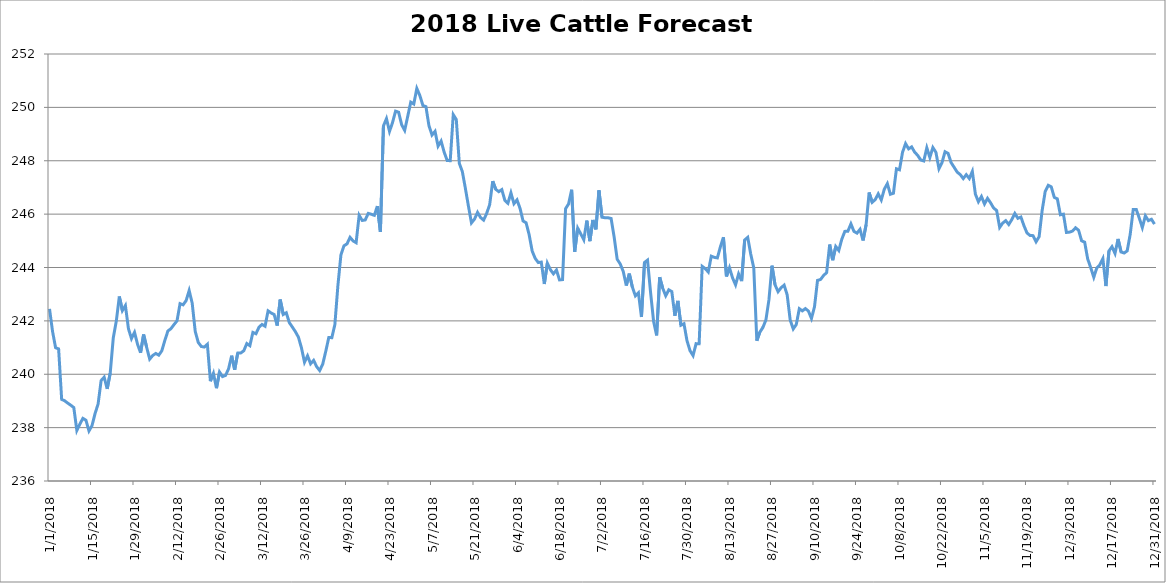
| Category | 2018 Live Cattle Forecast Model |
|---|---|
| 01/01/2018 | 242.449 |
| 02/01/2018 | 241.603 |
| 03/01/2018 | 240.994 |
| 04/01/2018 | 240.949 |
| 05/01/2018 | 239.059 |
| 06/01/2018 | 239.005 |
| 07/01/2018 | 238.918 |
| 08/01/2018 | 238.84 |
| 09/01/2018 | 238.751 |
| 10/01/2018 | 237.894 |
| 11/01/2018 | 238.135 |
| 12/01/2018 | 238.347 |
| 13/01/2018 | 238.277 |
| 14/01/2018 | 237.875 |
| 15/01/2018 | 238.075 |
| 16/01/2018 | 238.527 |
| 17/01/2018 | 238.882 |
| 18/01/2018 | 239.764 |
| 19/01/2018 | 239.89 |
| 20/01/2018 | 239.452 |
| 21/01/2018 | 240.049 |
| 22/01/2018 | 241.358 |
| 23/01/2018 | 241.991 |
| 24/01/2018 | 242.912 |
| 25/01/2018 | 242.385 |
| 26/01/2018 | 242.575 |
| 27/01/2018 | 241.707 |
| 28/01/2018 | 241.337 |
| 29/01/2018 | 241.57 |
| 30/01/2018 | 241.122 |
| 31/01/2018 | 240.807 |
| 01/02/2018 | 241.488 |
| 02/02/2018 | 241.01 |
| 03/02/2018 | 240.567 |
| 04/02/2018 | 240.703 |
| 05/02/2018 | 240.78 |
| 06/02/2018 | 240.716 |
| 07/02/2018 | 240.883 |
| 08/02/2018 | 241.271 |
| 09/02/2018 | 241.621 |
| 10/02/2018 | 241.71 |
| 11/02/2018 | 241.86 |
| 12/02/2018 | 242.002 |
| 13/02/2018 | 242.646 |
| 14/02/2018 | 242.601 |
| 15/02/2018 | 242.759 |
| 16/02/2018 | 243.138 |
| 17/02/2018 | 242.662 |
| 18/02/2018 | 241.605 |
| 19/02/2018 | 241.191 |
| 20/02/2018 | 241.04 |
| 21/02/2018 | 241.019 |
| 22/02/2018 | 241.123 |
| 23/02/2018 | 239.741 |
| 24/02/2018 | 240.033 |
| 25/02/2018 | 239.478 |
| 26/02/2018 | 240.085 |
| 27/02/2018 | 239.913 |
| 28/02/2018 | 239.957 |
| 01/03/2018 | 240.209 |
| 02/03/2018 | 240.696 |
| 03/03/2018 | 240.17 |
| 04/03/2018 | 240.793 |
| 05/03/2018 | 240.798 |
| 06/03/2018 | 240.882 |
| 07/03/2018 | 241.151 |
| 08/03/2018 | 241.071 |
| 09/03/2018 | 241.568 |
| 10/03/2018 | 241.518 |
| 11/03/2018 | 241.762 |
| 12/03/2018 | 241.867 |
| 13/03/2018 | 241.799 |
| 14/03/2018 | 242.375 |
| 15/03/2018 | 242.297 |
| 16/03/2018 | 242.238 |
| 17/03/2018 | 241.824 |
| 18/03/2018 | 242.798 |
| 19/03/2018 | 242.24 |
| 20/03/2018 | 242.304 |
| 21/03/2018 | 241.934 |
| 22/03/2018 | 241.768 |
| 23/03/2018 | 241.596 |
| 24/03/2018 | 241.388 |
| 25/03/2018 | 240.987 |
| 26/03/2018 | 240.451 |
| 27/03/2018 | 240.691 |
| 28/03/2018 | 240.393 |
| 29/03/2018 | 240.52 |
| 30/03/2018 | 240.286 |
| 31/03/2018 | 240.139 |
| 01/04/2018 | 240.38 |
| 02/04/2018 | 240.858 |
| 03/04/2018 | 241.378 |
| 04/04/2018 | 241.37 |
| 05/04/2018 | 241.86 |
| 06/04/2018 | 243.325 |
| 07/04/2018 | 244.479 |
| 08/04/2018 | 244.812 |
| 09/04/2018 | 244.887 |
| 10/04/2018 | 245.13 |
| 11/04/2018 | 244.997 |
| 12/04/2018 | 244.929 |
| 13/04/2018 | 245.957 |
| 14/04/2018 | 245.763 |
| 15/04/2018 | 245.781 |
| 16/04/2018 | 246.028 |
| 17/04/2018 | 245.996 |
| 18/04/2018 | 245.955 |
| 19/04/2018 | 246.301 |
| 20/04/2018 | 245.336 |
| 21/04/2018 | 249.305 |
| 22/04/2018 | 249.578 |
| 23/04/2018 | 249.098 |
| 24/04/2018 | 249.434 |
| 25/04/2018 | 249.859 |
| 26/04/2018 | 249.819 |
| 27/04/2018 | 249.351 |
| 28/04/2018 | 249.139 |
| 29/04/2018 | 249.664 |
| 30/04/2018 | 250.197 |
| 01/05/2018 | 250.126 |
| 02/05/2018 | 250.71 |
| 03/05/2018 | 250.443 |
| 04/05/2018 | 250.071 |
| 05/05/2018 | 250.027 |
| 06/05/2018 | 249.309 |
| 07/05/2018 | 248.964 |
| 08/05/2018 | 249.102 |
| 09/05/2018 | 248.549 |
| 10/05/2018 | 248.736 |
| 11/05/2018 | 248.323 |
| 12/05/2018 | 248.01 |
| 13/05/2018 | 248.001 |
| 14/05/2018 | 249.728 |
| 15/05/2018 | 249.547 |
| 16/05/2018 | 247.9 |
| 17/05/2018 | 247.591 |
| 18/05/2018 | 246.962 |
| 19/05/2018 | 246.3 |
| 20/05/2018 | 245.671 |
| 21/05/2018 | 245.813 |
| 22/05/2018 | 246.066 |
| 23/05/2018 | 245.872 |
| 24/05/2018 | 245.776 |
| 25/05/2018 | 246.023 |
| 26/05/2018 | 246.36 |
| 27/05/2018 | 247.236 |
| 28/05/2018 | 246.931 |
| 29/05/2018 | 246.842 |
| 30/05/2018 | 246.918 |
| 31/05/2018 | 246.515 |
| 01/06/2018 | 246.406 |
| 02/06/2018 | 246.797 |
| 03/06/2018 | 246.39 |
| 04/06/2018 | 246.532 |
| 05/06/2018 | 246.217 |
| 06/06/2018 | 245.743 |
| 07/06/2018 | 245.676 |
| 08/06/2018 | 245.228 |
| 09/06/2018 | 244.615 |
| 10/06/2018 | 244.34 |
| 11/06/2018 | 244.186 |
| 12/06/2018 | 244.203 |
| 13/06/2018 | 243.382 |
| 14/06/2018 | 244.163 |
| 15/06/2018 | 243.92 |
| 16/06/2018 | 243.761 |
| 17/06/2018 | 243.905 |
| 18/06/2018 | 243.535 |
| 19/06/2018 | 243.543 |
| 20/06/2018 | 246.204 |
| 21/06/2018 | 246.383 |
| 22/06/2018 | 246.915 |
| 23/06/2018 | 244.59 |
| 24/06/2018 | 245.475 |
| 25/06/2018 | 245.261 |
| 26/06/2018 | 245.041 |
| 27/06/2018 | 245.757 |
| 28/06/2018 | 244.987 |
| 29/06/2018 | 245.782 |
| 30/06/2018 | 245.431 |
| 01/07/2018 | 246.89 |
| 02/07/2018 | 245.887 |
| 03/07/2018 | 245.863 |
| 04/07/2018 | 245.863 |
| 05/07/2018 | 245.834 |
| 06/07/2018 | 245.143 |
| 07/07/2018 | 244.308 |
| 08/07/2018 | 244.132 |
| 09/07/2018 | 243.849 |
| 10/07/2018 | 243.324 |
| 11/07/2018 | 243.771 |
| 12/07/2018 | 243.267 |
| 13/07/2018 | 242.937 |
| 14/07/2018 | 243.051 |
| 15/07/2018 | 242.144 |
| 16/07/2018 | 244.189 |
| 17/07/2018 | 244.279 |
| 18/07/2018 | 243.068 |
| 19/07/2018 | 241.978 |
| 20/07/2018 | 241.459 |
| 21/07/2018 | 243.634 |
| 22/07/2018 | 243.223 |
| 23/07/2018 | 242.941 |
| 24/07/2018 | 243.163 |
| 25/07/2018 | 243.097 |
| 26/07/2018 | 242.192 |
| 27/07/2018 | 242.749 |
| 28/07/2018 | 241.838 |
| 29/07/2018 | 241.894 |
| 30/07/2018 | 241.256 |
| 31/07/2018 | 240.884 |
| 01/08/2018 | 240.7 |
| 02/08/2018 | 241.147 |
| 03/08/2018 | 241.142 |
| 04/08/2018 | 244.044 |
| 05/08/2018 | 243.959 |
| 06/08/2018 | 243.831 |
| 07/08/2018 | 244.425 |
| 08/08/2018 | 244.38 |
| 09/08/2018 | 244.359 |
| 10/08/2018 | 244.774 |
| 11/08/2018 | 245.134 |
| 12/08/2018 | 243.664 |
| 13/08/2018 | 243.99 |
| 14/08/2018 | 243.612 |
| 15/08/2018 | 243.35 |
| 16/08/2018 | 243.76 |
| 17/08/2018 | 243.493 |
| 18/08/2018 | 245.035 |
| 19/08/2018 | 245.131 |
| 20/08/2018 | 244.501 |
| 21/08/2018 | 243.986 |
| 22/08/2018 | 241.256 |
| 23/08/2018 | 241.579 |
| 24/08/2018 | 241.754 |
| 25/08/2018 | 242.037 |
| 26/08/2018 | 242.796 |
| 27/08/2018 | 244.067 |
| 28/08/2018 | 243.352 |
| 29/08/2018 | 243.093 |
| 30/08/2018 | 243.244 |
| 31/08/2018 | 243.338 |
| 01/09/2018 | 242.976 |
| 02/09/2018 | 242.027 |
| 03/09/2018 | 241.697 |
| 04/09/2018 | 241.864 |
| 05/09/2018 | 242.457 |
| 06/09/2018 | 242.375 |
| 07/09/2018 | 242.461 |
| 08/09/2018 | 242.368 |
| 09/09/2018 | 242.09 |
| 10/09/2018 | 242.528 |
| 11/09/2018 | 243.517 |
| 12/09/2018 | 243.551 |
| 13/09/2018 | 243.703 |
| 14/09/2018 | 243.807 |
| 15/09/2018 | 244.86 |
| 16/09/2018 | 244.273 |
| 17/09/2018 | 244.786 |
| 18/09/2018 | 244.638 |
| 19/09/2018 | 245.062 |
| 20/09/2018 | 245.353 |
| 21/09/2018 | 245.36 |
| 22/09/2018 | 245.634 |
| 23/09/2018 | 245.353 |
| 24/09/2018 | 245.288 |
| 25/09/2018 | 245.431 |
| 26/09/2018 | 245.013 |
| 27/09/2018 | 245.601 |
| 28/09/2018 | 246.81 |
| 29/09/2018 | 246.442 |
| 30/09/2018 | 246.544 |
| 01/10/2018 | 246.758 |
| 02/10/2018 | 246.532 |
| 03/10/2018 | 246.935 |
| 04/10/2018 | 247.142 |
| 05/10/2018 | 246.744 |
| 06/10/2018 | 246.783 |
| 07/10/2018 | 247.7 |
| 08/10/2018 | 247.661 |
| 09/10/2018 | 248.315 |
| 10/10/2018 | 248.642 |
| 11/10/2018 | 248.446 |
| 12/10/2018 | 248.519 |
| 13/10/2018 | 248.322 |
| 14/10/2018 | 248.2 |
| 15/10/2018 | 248.028 |
| 16/10/2018 | 247.992 |
| 17/10/2018 | 248.486 |
| 18/10/2018 | 248.123 |
| 19/10/2018 | 248.495 |
| 20/10/2018 | 248.317 |
| 21/10/2018 | 247.704 |
| 22/10/2018 | 247.93 |
| 23/10/2018 | 248.337 |
| 24/10/2018 | 248.279 |
| 25/10/2018 | 247.932 |
| 26/10/2018 | 247.756 |
| 27/10/2018 | 247.575 |
| 28/10/2018 | 247.483 |
| 29/10/2018 | 247.332 |
| 30/10/2018 | 247.479 |
| 31/10/2018 | 247.335 |
| 01/11/2018 | 247.6 |
| 02/11/2018 | 246.75 |
| 03/11/2018 | 246.466 |
| 04/11/2018 | 246.661 |
| 05/11/2018 | 246.381 |
| 06/11/2018 | 246.591 |
| 07/11/2018 | 246.425 |
| 08/11/2018 | 246.231 |
| 09/11/2018 | 246.136 |
| 10/11/2018 | 245.502 |
| 11/11/2018 | 245.666 |
| 12/11/2018 | 245.755 |
| 13/11/2018 | 245.612 |
| 14/11/2018 | 245.797 |
| 15/11/2018 | 246.025 |
| 16/11/2018 | 245.842 |
| 17/11/2018 | 245.89 |
| 18/11/2018 | 245.567 |
| 19/11/2018 | 245.295 |
| 20/11/2018 | 245.201 |
| 21/11/2018 | 245.193 |
| 22/11/2018 | 244.966 |
| 23/11/2018 | 245.155 |
| 24/11/2018 | 246.14 |
| 25/11/2018 | 246.849 |
| 26/11/2018 | 247.08 |
| 27/11/2018 | 247.021 |
| 28/11/2018 | 246.626 |
| 29/11/2018 | 246.571 |
| 30/11/2018 | 245.976 |
| 01/12/2018 | 245.999 |
| 02/12/2018 | 245.312 |
| 03/12/2018 | 245.326 |
| 04/12/2018 | 245.365 |
| 05/12/2018 | 245.488 |
| 06/12/2018 | 245.395 |
| 07/12/2018 | 245 |
| 08/12/2018 | 244.95 |
| 09/12/2018 | 244.321 |
| 10/12/2018 | 243.994 |
| 11/12/2018 | 243.635 |
| 12/12/2018 | 243.983 |
| 13/12/2018 | 244.101 |
| 14/12/2018 | 244.331 |
| 15/12/2018 | 243.306 |
| 16/12/2018 | 244.62 |
| 17/12/2018 | 244.78 |
| 18/12/2018 | 244.527 |
| 19/12/2018 | 245.07 |
| 20/12/2018 | 244.58 |
| 21/12/2018 | 244.543 |
| 22/12/2018 | 244.621 |
| 23/12/2018 | 245.241 |
| 24/12/2018 | 246.177 |
| 25/12/2018 | 246.177 |
| 26/12/2018 | 245.842 |
| 27/12/2018 | 245.497 |
| 28/12/2018 | 245.934 |
| 29/12/2018 | 245.756 |
| 30/12/2018 | 245.808 |
| 31/12/2018 | 245.627 |